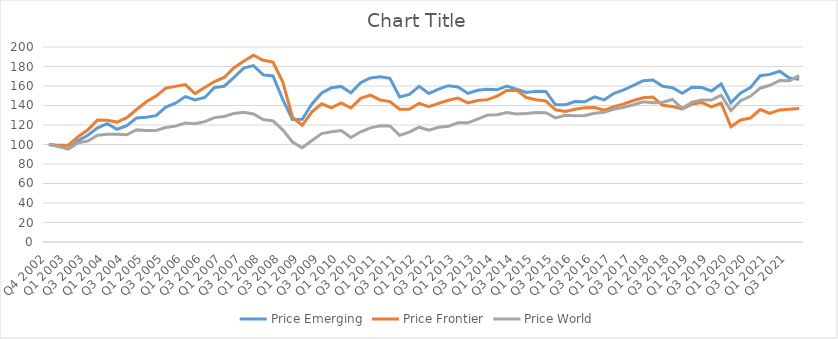
| Category | Price Emerging | Price Frontier | Price World |
|---|---|---|---|
| Q4 2002 | 100 | 100 | 100 |
| Q4 2002 | 98.499 | 99.309 | 97.795 |
| Q1 2003 | 95.493 | 99.258 | 95.392 |
| Q2 2003 | 103.804 | 108.027 | 101.667 |
| Q3 2003 | 109.517 | 115.08 | 103.58 |
| Q4 2003 | 117.087 | 125.139 | 109.446 |
| Q1 2004 | 121.409 | 124.845 | 110.482 |
| Q2 2004 | 115.652 | 122.985 | 110.633 |
| Q3 2004 | 119.235 | 127.505 | 109.966 |
| Q4 2004 | 127.28 | 135.906 | 115.205 |
| Q1 2005 | 127.941 | 143.802 | 114.422 |
| Q2 2005 | 129.585 | 149.67 | 114.319 |
| Q3 2005 | 138.427 | 157.828 | 117.479 |
| Q4 2005 | 142.398 | 159.615 | 118.855 |
| Q1 2006 | 149.136 | 161.387 | 121.934 |
| Q2 2006 | 145.739 | 152.286 | 121.33 |
| Q3 2006 | 148.28 | 158.442 | 123.421 |
| Q4 2006 | 158.546 | 164.587 | 127.559 |
| Q1 2007 | 159.771 | 168.754 | 128.69 |
| Q2 2007 | 168.901 | 178.725 | 131.853 |
| Q3 2007 | 178.321 | 185.403 | 132.958 |
| Q4 2007 | 180.893 | 191.512 | 131.353 |
| Q1 2008 | 171.455 | 186.413 | 125.64 |
| Q2 2008 | 170.268 | 184.516 | 124.285 |
| Q3 2008 | 146.372 | 164.266 | 115.087 |
| Q4 2008 | 125.541 | 128.136 | 102.556 |
| Q1 2009 | 125.822 | 119.725 | 96.609 |
| Q2 2009 | 141.638 | 133.584 | 104.163 |
| Q3 2009 | 152.886 | 141.716 | 111.227 |
| Q4 2009 | 158.15 | 137.618 | 112.973 |
| Q1 2010 | 159.583 | 142.569 | 114.301 |
| Q2 2010 | 152.94 | 137.394 | 107.238 |
| Q3 2010 | 163.46 | 147.255 | 113.029 |
| Q4 2010 | 168.298 | 150.693 | 117.059 |
| Q1 2011 | 169.525 | 145.693 | 119.192 |
| Q2 2011 | 167.958 | 143.968 | 119.047 |
| Q3 2011 | 148.715 | 136.133 | 109.375 |
| Q4 2011 | 151.3 | 136.094 | 112.639 |
| Q1 2012 | 159.706 | 142.226 | 117.719 |
| Q2 2012 | 152.402 | 138.839 | 114.656 |
| Q3 2012 | 156.86 | 142.174 | 117.62 |
| Q4 2012 | 160.339 | 145.403 | 118.661 |
| Q1 2013 | 158.987 | 147.62 | 122.231 |
| Q2 2013 | 152.37 | 142.703 | 122.195 |
| Q3 2013 | 155.606 | 145.192 | 126.123 |
| Q4 2013 | 156.64 | 146.021 | 130.138 |
| Q1 2014 | 156.093 | 149.633 | 130.572 |
| Q2 2014 | 159.814 | 155.39 | 132.88 |
| Q3 2014 | 156.745 | 155.735 | 131.371 |
| Q4 2014 | 153.342 | 148.161 | 131.748 |
| Q1 2015 | 154.602 | 145.943 | 132.78 |
| Q2 2015 | 154.442 | 144.607 | 132.608 |
| Q3 2015 | 140.693 | 135.57 | 127.268 |
| Q4 2015 | 140.854 | 133.87 | 130.024 |
| Q1 2016 | 144.055 | 136.115 | 129.523 |
| Q2 2016 | 143.852 | 137.727 | 129.698 |
| Q3 2016 | 148.843 | 137.868 | 132.113 |
| Q4 2016 | 145.826 | 135.131 | 132.956 |
| Q1 2017 | 152.518 | 138.835 | 136.24 |
| Q2 2017 | 156.046 | 141.687 | 138.209 |
| Q3 2017 | 160.642 | 145.116 | 140.788 |
| Q4 2017 | 165.423 | 147.981 | 143.855 |
| Q1 2018 | 166.19 | 148.638 | 142.758 |
| Q2 2018 | 159.655 | 140.219 | 143.428 |
| Q3 2018 | 158.239 | 138.983 | 146.189 |
| Q4 2018 | 152.63 | 136.383 | 136.805 |
| Q1 2019 | 158.684 | 141.43 | 143.475 |
| Q2 2019 | 158.47 | 143.164 | 145.528 |
| Q3 2019 | 154.864 | 138.583 | 145.577 |
| Q4 2019 | 162.097 | 142.294 | 150.551 |
| Q1 2020 | 142.897 | 118.166 | 134.77 |
| Q2 2020 | 152.781 | 125.141 | 144.873 |
| Q3 2020 | 158.337 | 127.143 | 149.433 |
| Q4 2020 | 170.495 | 135.841 | 157.728 |
| Q1 2021 | 171.924 | 131.91 | 160.758 |
| Q2 2021 | 175.155 | 135.497 | 165.684 |
| Q3 2021 | 168.113 | 136.076 | 165.43 |
| Q4 2021 | 166.874 | 137.025 | 170.617 |